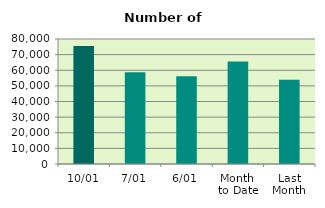
| Category | Series 0 |
|---|---|
| 10/01 | 75552 |
| 7/01 | 58704 |
| 6/01 | 56240 |
| Month 
to Date | 65673.2 |
| Last
Month | 53997.143 |